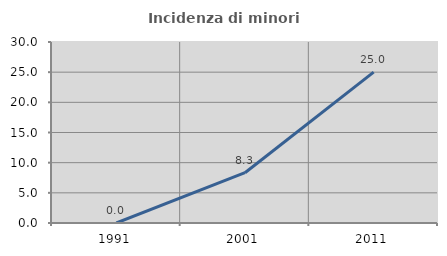
| Category | Incidenza di minori stranieri |
|---|---|
| 1991.0 | 0 |
| 2001.0 | 8.333 |
| 2011.0 | 25 |